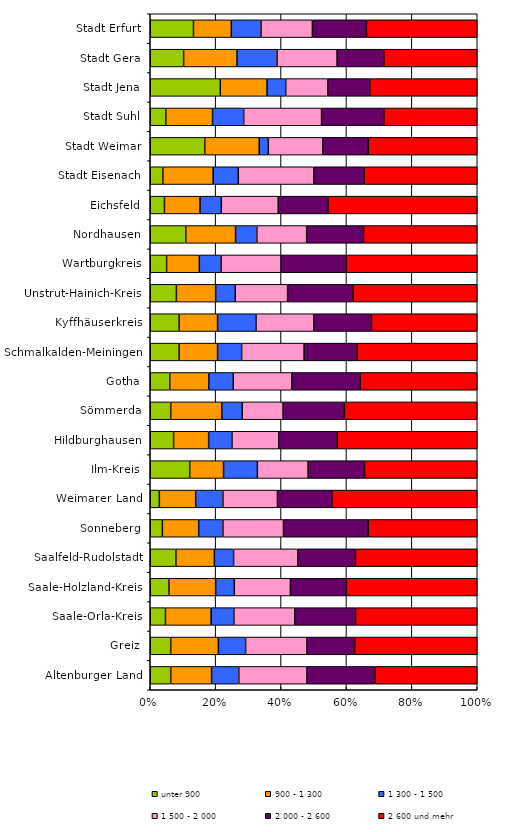
| Category | unter 900  | 900 - 1 300 | 1 300 - 1 500 | 1 500 - 2 000 | 2 000 - 2 600 | 2 600 und mehr |
|---|---|---|---|---|---|---|
| Altenburger Land | 3 | 6 | 4 | 10 | 10 | 15 |
| Greiz | 3 | 7 | 4 | 9 | 7 | 18 |
| Saale-Orla-Kreis | 2 | 6 | 3 | 8 | 8 | 16 |
| Saale-Holzland-Kreis | 2 | 5 | 2 | 6 | 6 | 14 |
| Saalfeld-Rudolstadt | 4 | 6 | 3 | 10 | 9 | 19 |
| Sonneberg | 1 | 3 | 2 | 5 | 7 | 9 |
| Weimarer Land | 1 | 4 | 3 | 6 | 6 | 16 |
| Ilm-Kreis | 7 | 6 | 6 | 9 | 10 | 20 |
| Hildburghausen | 2 | 3 | 2 | 4 | 5 | 12 |
| Sömmerda | 2 | 5 | 2 | 4 | 6 | 13 |
| Gotha | 4 | 8 | 5 | 12 | 14 | 24 |
| Schmalkalden-Meiningen | 6 | 8 | 5 | 13 | 11 | 25 |
| Kyffhäuserkreis | 3 | 4 | 4 | 6 | 6 | 11 |
| Unstrut-Hainich-Kreis | 4 | 6 | 3 | 8 | 10 | 19 |
| Wartburgkreis | 3 | 6 | 4 | 11 | 12 | 24 |
| Nordhausen | 5 | 7 | 3 | 7 | 8 | 16 |
| Eichsfeld | 2 | 5 | 3 | 8 | 7 | 21 |
| Stadt Eisenach | 1 | 4 | 2 | 6 | 4 | 9 |
| Stadt Weimar | 6 | 6 | 1 | 6 | 5 | 12 |
| Stadt Suhl | 1 | 3 | 2 | 5 | 4 | 6 |
| Stadt Jena | 15 | 10 | 4 | 9 | 9 | 23 |
| Stadt Gera | 5 | 8 | 6 | 9 | 7 | 14 |
| Stadt Erfurt | 16 | 14 | 11 | 19 | 20 | 41 |